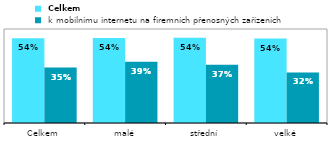
| Category |  Celkem |  k mobilnímu internetu na firemních přenosných zařízeních |
|---|---|---|
| Celkem | 0.541 | 0.354 |
| malé | 0.543 | 0.39 |
| střední | 0.544 | 0.371 |
| velké | 0.539 | 0.323 |